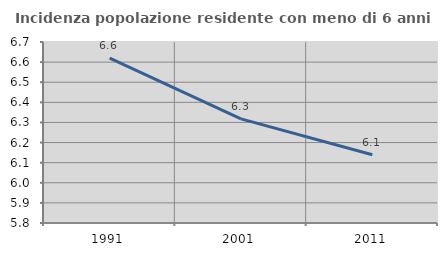
| Category | Incidenza popolazione residente con meno di 6 anni |
|---|---|
| 1991.0 | 6.62 |
| 2001.0 | 6.318 |
| 2011.0 | 6.14 |